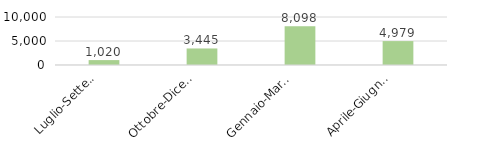
| Category | Abruzzo |
|---|---|
| Luglio-Settembre 
2020 | 1019.989 |
| Ottobre-Dicembre 
2020 | 3444.891 |
| Gennaio-Marzo 
2021 | 8097.711 |
| Aprile-Giugno
 2021 | 4978.78 |